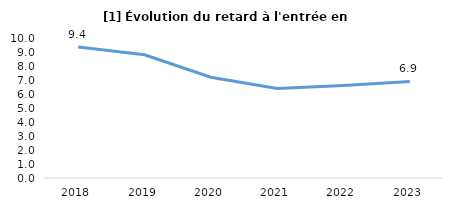
| Category | Total en retard |
|---|---|
| 2018 | 9.352 |
| 2019 | 8.8 |
| 2020 | 7.2 |
| 2021 | 6.4 |
| 2022 | 6.6 |
| 2023 | 6.9 |